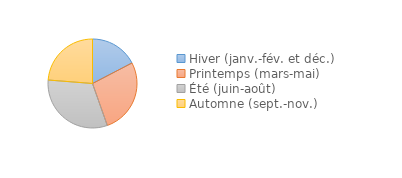
| Category | Series 0 |
|---|---|
| Hiver (janv.-fév. et déc.) | 17.37 |
| Printemps (mars-mai) | 27.23 |
| Été (juin-août) | 31.66 |
| Automne (sept.-nov.) | 23.75 |